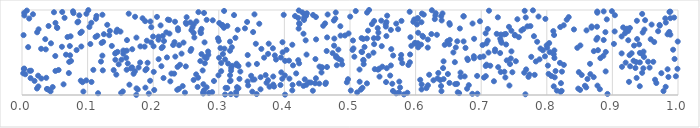
| Category | Series 0 |
|---|---|
| 0.17415233555775167 | 0.001 |
| 0.3267165777901435 | 0.003 |
| 0.40098579643262144 | 0.004 |
| 0.3095688186103528 | 0.006 |
| 0.5822616373367977 | 0.007 |
| 0.7673834045400926 | 0.008 |
| 0.3184749597028139 | 0.01 |
| 0.3576364063214017 | 0.011 |
| 0.8924957382449441 | 0.013 |
| 0.6864519221195118 | 0.014 |
| 0.6941650764544121 | 0.015 |
| 0.19330679095265535 | 0.017 |
| 0.2762896704294624 | 0.018 |
| 0.5704483367503989 | 0.02 |
| 0.11596705233783045 | 0.021 |
| 0.6663620786262896 | 0.022 |
| 0.28502951752498995 | 0.024 |
| 0.1511861886473287 | 0.025 |
| 0.5874161819290087 | 0.026 |
| 0.24837753763317516 | 0.028 |
| 0.5746186854391183 | 0.029 |
| 0.5109133764841309 | 0.031 |
| 0.6642649701503108 | 0.032 |
| 0.2898470303478975 | 0.033 |
| 0.27629961000573255 | 0.035 |
| 0.3264565690923459 | 0.036 |
| 0.8209746362123888 | 0.038 |
| 0.35108139517483206 | 0.039 |
| 0.09357554995508288 | 0.04 |
| 0.1536715389560417 | 0.042 |
| 0.04352839681271592 | 0.043 |
| 0.6394245126020789 | 0.045 |
| 0.9778816277948084 | 0.046 |
| 0.5655316001285667 | 0.047 |
| 0.8226224078419966 | 0.049 |
| 0.44337046952986003 | 0.05 |
| 0.8153181918369967 | 0.052 |
| 0.5012525339147966 | 0.053 |
| 0.41199090207481726 | 0.054 |
| 0.27743254483263613 | 0.056 |
| 0.04132815661761591 | 0.057 |
| 0.2015772101087575 | 0.059 |
| 0.8507807914339004 | 0.06 |
| 0.2366212121968162 | 0.061 |
| 0.5164366669893682 | 0.063 |
| 0.176457744678861 | 0.064 |
| 0.6090822513360802 | 0.066 |
| 0.36361335129340977 | 0.067 |
| 0.8808942582099177 | 0.068 |
| 0.03855602436475558 | 0.07 |
| 0.03803766517475782 | 0.071 |
| 0.23924007262587177 | 0.073 |
| 0.6784871758009946 | 0.074 |
| 0.8479532505951944 | 0.075 |
| 0.02287641990411038 | 0.077 |
| 0.1745891157942836 | 0.078 |
| 0.32995453502639416 | 0.079 |
| 0.6165151254171015 | 0.081 |
| 0.3128138252140522 | 0.082 |
| 0.3103818537578985 | 0.084 |
| 0.5190177345153396 | 0.085 |
| 0.18812397332812403 | 0.086 |
| 0.5763704846900805 | 0.088 |
| 0.8601183373076069 | 0.089 |
| 0.2814577322502573 | 0.091 |
| 0.32777769170459603 | 0.092 |
| 0.0467712006635278 | 0.093 |
| 0.2676915436617193 | 0.095 |
| 0.9812395779526505 | 0.096 |
| 0.37728414601620885 | 0.098 |
| 0.3842804015212071 | 0.099 |
| 0.02496216016820807 | 0.1 |
| 0.8105937593416628 | 0.102 |
| 0.9417160902518191 | 0.103 |
| 0.24493541329987856 | 0.105 |
| 0.6388234430418588 | 0.106 |
| 0.4290893445407079 | 0.107 |
| 0.8581404154737656 | 0.109 |
| 0.8772539218580032 | 0.11 |
| 0.7430241985343964 | 0.112 |
| 0.34477042719911133 | 0.113 |
| 0.6188354076364074 | 0.114 |
| 0.6810784169923804 | 0.116 |
| 0.39401045223231845 | 0.117 |
| 0.41245318495903494 | 0.119 |
| 0.43348443813965465 | 0.12 |
| 0.1637524203750127 | 0.121 |
| 0.38302824945062586 | 0.123 |
| 0.6092952466262179 | 0.124 |
| 0.06334629622360777 | 0.126 |
| 0.27645927020184113 | 0.127 |
| 0.6603495523566433 | 0.128 |
| 0.4625039786047813 | 0.13 |
| 0.6632460137972748 | 0.131 |
| 0.564435676206291 | 0.132 |
| 0.45317203978727016 | 0.134 |
| 0.42229318997480314 | 0.135 |
| 0.525840197390822 | 0.137 |
| 0.44677677184521647 | 0.138 |
| 0.821569245726998 | 0.139 |
| 0.9669668168928013 | 0.141 |
| 0.651630823291615 | 0.142 |
| 0.37274753102901736 | 0.144 |
| 0.46330215005993314 | 0.145 |
| 0.44029828310587094 | 0.146 |
| 0.43697004434812636 | 0.148 |
| 0.4951958973078491 | 0.149 |
| 0.09221263411865321 | 0.151 |
| 0.5549433149496668 | 0.152 |
| 0.1059565645538566 | 0.153 |
| 0.9253044074732074 | 0.155 |
| 0.5147080072962037 | 0.156 |
| 0.5751608997674716 | 0.158 |
| 0.34383115924762087 | 0.159 |
| 0.22613279811140863 | 0.16 |
| 0.7193987672047559 | 0.162 |
| 0.3170114172833569 | 0.163 |
| 0.2926358629292709 | 0.165 |
| 0.019064845973301603 | 0.166 |
| 0.19534812638048005 | 0.167 |
| 0.08961814393098977 | 0.169 |
| 0.3180019052779104 | 0.17 |
| 0.09794480573317665 | 0.172 |
| 0.6272224001311495 | 0.173 |
| 0.37506632999475775 | 0.174 |
| 0.6375335263933828 | 0.176 |
| 0.26165451568351583 | 0.177 |
| 0.6070525270367 | 0.179 |
| 0.9650103187007967 | 0.18 |
| 0.3514966595963539 | 0.181 |
| 0.35440789176859755 | 0.183 |
| 0.4310460891625082 | 0.184 |
| 0.4969971830480029 | 0.185 |
| 0.6426773827214013 | 0.187 |
| 0.8620063767366707 | 0.188 |
| 0.3314923231673542 | 0.19 |
| 0.3967371370787942 | 0.191 |
| 0.4076647048097607 | 0.192 |
| 0.02951782544512571 | 0.194 |
| 0.6334205564746916 | 0.195 |
| 0.4480365862461576 | 0.197 |
| 0.01308138685638438 | 0.198 |
| 0.2157391287326743 | 0.199 |
| 0.9369051288633318 | 0.201 |
| 0.03697881213068965 | 0.202 |
| 0.2684537085140726 | 0.204 |
| 0.7042880043128501 | 0.205 |
| 0.7368283907138232 | 0.206 |
| 0.8120638520166237 | 0.208 |
| 0.36376261681447997 | 0.209 |
| 0.8714855880579583 | 0.211 |
| 0.9853747208453758 | 0.212 |
| 0.7720695899457407 | 0.213 |
| 0.6685496223278226 | 0.215 |
| 0.5449723636573165 | 0.216 |
| 0.38300510460076775 | 0.218 |
| 0.6747988309976195 | 0.219 |
| 0.9967311171504589 | 0.22 |
| 0.7070521014617873 | 0.222 |
| 0.8071010924647902 | 0.223 |
| 0.6937895449187815 | 0.225 |
| 0.34931400348166486 | 0.226 |
| 0.02459828179625989 | 0.227 |
| 0.5612804648814013 | 0.229 |
| 0.4006789493915881 | 0.23 |
| 0.2994649585555704 | 0.232 |
| 0.3171430444057638 | 0.233 |
| 0.371367907186257 | 0.234 |
| 0.8532139129370673 | 0.236 |
| 0.7815103298390677 | 0.237 |
| 0.6207198406196087 | 0.238 |
| 0.14377193633414076 | 0.24 |
| 0.7735291892319879 | 0.241 |
| 0.2655019760378562 | 0.243 |
| 0.004948661072919802 | 0.244 |
| 0.8663802341256382 | 0.245 |
| 0.6492464571617418 | 0.247 |
| 0.8027420928507824 | 0.248 |
| 0.17009956933439285 | 0.25 |
| 0.23194339100037786 | 0.251 |
| 0.22777536037365254 | 0.252 |
| 0.41796600102300896 | 0.254 |
| 0.0018266469628940296 | 0.255 |
| 0.974643296418802 | 0.257 |
| 0.07139645209975332 | 0.258 |
| 0.6346040305609278 | 0.259 |
| 0.9453311780595132 | 0.261 |
| 0.7655889091287048 | 0.262 |
| 0.6685031744909532 | 0.264 |
| 0.4565505367451058 | 0.265 |
| 0.39528963762454494 | 0.266 |
| 0.7475339834609904 | 0.268 |
| 0.8488357212828215 | 0.269 |
| 0.7298081395161048 | 0.271 |
| 0.20082721708117135 | 0.272 |
| 0.7353295032465735 | 0.273 |
| 0.8230739943740694 | 0.275 |
| 0.33283538690399594 | 0.276 |
| 0.8897371701881751 | 0.278 |
| 0.17214513579734347 | 0.279 |
| 0.30367517558359436 | 0.28 |
| 0.8133298844675799 | 0.282 |
| 0.05099729489354676 | 0.283 |
| 0.011521324529946031 | 0.285 |
| 0.013759557636553676 | 0.286 |
| 0.3186810237401636 | 0.287 |
| 0.27540157090866235 | 0.289 |
| 0.12318280177487839 | 0.29 |
| 0.18816721136988834 | 0.291 |
| 0.139754426446423 | 0.293 |
| 0.0557760979531049 | 0.294 |
| 0.10874776882634662 | 0.296 |
| 0.1595218511214106 | 0.297 |
| 0.5426716711792345 | 0.298 |
| 0.5145205345386216 | 0.3 |
| 0.7685551467430047 | 0.301 |
| 0.9841401926982285 | 0.303 |
| 0.5377680364203787 | 0.304 |
| 0.002790070709704051 | 0.305 |
| 0.19003148126588532 | 0.307 |
| 0.9991593876172473 | 0.308 |
| 0.5446796335226294 | 0.31 |
| 0.0034139228578822234 | 0.311 |
| 0.1661026218302183 | 0.312 |
| 0.9471727730132119 | 0.314 |
| 0.5560882416403484 | 0.315 |
| 0.6418930240726614 | 0.317 |
| 0.9350765748615465 | 0.318 |
| 0.31893316954166384 | 0.319 |
| 0.45663217339878803 | 0.321 |
| 0.9566968369750841 | 0.322 |
| 0.17776330132469131 | 0.324 |
| 0.16786929917665339 | 0.325 |
| 0.45737237359137506 | 0.326 |
| 0.7259172164810624 | 0.328 |
| 0.46493962354778906 | 0.329 |
| 0.2371007303200896 | 0.331 |
| 0.9146226458355605 | 0.332 |
| 0.5493048259949521 | 0.333 |
| 0.45347214442592265 | 0.335 |
| 0.24970544762589053 | 0.336 |
| 0.9270363470228813 | 0.338 |
| 0.21251791548318688 | 0.339 |
| 0.3300206388064093 | 0.34 |
| 0.7068771850372884 | 0.342 |
| 0.3202887589511859 | 0.343 |
| 0.7138243101014865 | 0.344 |
| 0.8016571773127329 | 0.346 |
| 0.5622863411028683 | 0.347 |
| 0.41314753268536264 | 0.349 |
| 0.47991731931818304 | 0.35 |
| 0.3272677256531865 | 0.351 |
| 0.5890447886579944 | 0.353 |
| 0.8260133097288356 | 0.354 |
| 0.24079937639113835 | 0.356 |
| 0.7082039247142847 | 0.357 |
| 0.3451896654648441 | 0.358 |
| 0.48807294405046653 | 0.36 |
| 0.14739519636854015 | 0.361 |
| 0.5208737998015173 | 0.363 |
| 0.7439602116562637 | 0.364 |
| 0.35812059726106593 | 0.365 |
| 0.8658779519833733 | 0.367 |
| 0.3270015078273788 | 0.368 |
| 0.31417306729617045 | 0.37 |
| 0.16124894606557016 | 0.371 |
| 0.4224524498261405 | 0.372 |
| 0.2787610209251118 | 0.374 |
| 0.5797096729756539 | 0.375 |
| 0.3037310757513245 | 0.377 |
| 0.820062562262344 | 0.378 |
| 0.1914411227012931 | 0.379 |
| 0.9202256342344645 | 0.381 |
| 0.18013497787109856 | 0.382 |
| 0.9418677939853222 | 0.384 |
| 0.5912987097032684 | 0.385 |
| 0.6598378487785811 | 0.386 |
| 0.9361186530822996 | 0.388 |
| 0.07193848168688477 | 0.389 |
| 0.9622964580040382 | 0.391 |
| 0.9544586460834988 | 0.392 |
| 0.12037344095584457 | 0.393 |
| 0.7833126621325796 | 0.395 |
| 0.6426503610479861 | 0.396 |
| 0.7528084016367185 | 0.397 |
| 0.2718318339091724 | 0.399 |
| 0.07470944575363936 | 0.4 |
| 0.40100723120940684 | 0.402 |
| 0.9322287336178012 | 0.403 |
| 0.4070138547738472 | 0.404 |
| 0.5205908228571432 | 0.406 |
| 0.7389741432773567 | 0.407 |
| 0.48666302206728407 | 0.409 |
| 0.4210883871660678 | 0.41 |
| 0.6796588095273353 | 0.411 |
| 0.5202987781710223 | 0.413 |
| 0.14231063344503814 | 0.414 |
| 0.1516518420782318 | 0.416 |
| 0.3872554624740119 | 0.417 |
| 0.30962789337811125 | 0.418 |
| 0.7889038093619225 | 0.42 |
| 0.20827016756323247 | 0.421 |
| 0.44732396953738807 | 0.423 |
| 0.9947643522647984 | 0.424 |
| 0.577511258207087 | 0.425 |
| 0.48237957960391575 | 0.427 |
| 0.6788129393775014 | 0.428 |
| 0.7450990057050695 | 0.43 |
| 0.6890320740514729 | 0.431 |
| 0.28123378168493607 | 0.432 |
| 0.8816480415287197 | 0.434 |
| 0.8116252203139921 | 0.435 |
| 0.15885355957091496 | 0.437 |
| 0.3004359381533074 | 0.438 |
| 0.36907393993050197 | 0.439 |
| 0.3947218594014984 | 0.441 |
| 0.22097429583907702 | 0.442 |
| 0.4789147564621785 | 0.444 |
| 0.6982419258656538 | 0.445 |
| 0.27841420636827996 | 0.446 |
| 0.9481272680273157 | 0.448 |
| 0.7763260805430761 | 0.449 |
| 0.5066614631459274 | 0.45 |
| 0.23372250872603717 | 0.452 |
| 0.7034669911681022 | 0.453 |
| 0.7972142841480359 | 0.455 |
| 0.6887878371026958 | 0.456 |
| 0.4789246282539622 | 0.457 |
| 0.050767545233491584 | 0.459 |
| 0.8861802202640587 | 0.46 |
| 0.528428203315386 | 0.462 |
| 0.12253264694324839 | 0.463 |
| 0.5658194856325022 | 0.464 |
| 0.38539994520536713 | 0.466 |
| 0.07330444784688295 | 0.467 |
| 0.9261048215978862 | 0.469 |
| 0.34404274068990004 | 0.47 |
| 0.5780252835930141 | 0.471 |
| 0.2839979004586286 | 0.473 |
| 0.06705130902829493 | 0.474 |
| 0.43375953238941145 | 0.476 |
| 0.5915856020830247 | 0.477 |
| 0.8105740236920781 | 0.478 |
| 0.945598132822877 | 0.48 |
| 0.27363380977452767 | 0.481 |
| 0.3063295332636441 | 0.483 |
| 0.3751199429993607 | 0.484 |
| 0.1544873756792463 | 0.485 |
| 0.24321166438118713 | 0.487 |
| 0.14199709213032607 | 0.488 |
| 0.9140884247214297 | 0.49 |
| 0.929307224070591 | 0.491 |
| 0.47353826414352473 | 0.492 |
| 0.7288646641995803 | 0.494 |
| 0.9418626475651848 | 0.495 |
| 0.14325278197183744 | 0.497 |
| 0.5357465610791718 | 0.498 |
| 0.7111420451661441 | 0.499 |
| 0.6575737055788774 | 0.501 |
| 0.3972704596863019 | 0.502 |
| 0.8045725542828471 | 0.503 |
| 0.5184198281885304 | 0.505 |
| 0.8899040462911296 | 0.506 |
| 0.1456850999443008 | 0.508 |
| 0.5175489234509786 | 0.509 |
| 0.9474430778498911 | 0.51 |
| 0.28371311812516453 | 0.512 |
| 0.7460719760933302 | 0.513 |
| 0.7208890189913058 | 0.515 |
| 0.8717082323191946 | 0.516 |
| 0.46441128369593276 | 0.517 |
| 0.25685689420846414 | 0.519 |
| 0.31709009754065354 | 0.52 |
| 0.15964998082277837 | 0.522 |
| 0.15446482413654794 | 0.523 |
| 0.8115301125599712 | 0.524 |
| 0.7940475552965478 | 0.526 |
| 0.8780484284898948 | 0.527 |
| 0.08318880557032915 | 0.529 |
| 0.5038113073030006 | 0.53 |
| 0.40328641560530154 | 0.531 |
| 0.9925636243431475 | 0.533 |
| 0.4822106204363793 | 0.534 |
| 0.7211631276536827 | 0.536 |
| 0.03624535340826662 | 0.537 |
| 0.16804245037708265 | 0.538 |
| 0.5629066993704978 | 0.54 |
| 0.25809949093618734 | 0.541 |
| 0.3648838105701584 | 0.543 |
| 0.029150309871996738 | 0.544 |
| 0.30862525296487564 | 0.545 |
| 0.7903981931281537 | 0.547 |
| 0.5052684386187392 | 0.548 |
| 0.3824597620944087 | 0.55 |
| 0.3025145370402663 | 0.551 |
| 0.21284540762783843 | 0.552 |
| 0.676075702887164 | 0.554 |
| 0.8465178849497058 | 0.555 |
| 0.8005445903762116 | 0.556 |
| 0.6185038238779765 | 0.558 |
| 0.661259090904995 | 0.559 |
| 0.6038401962392357 | 0.561 |
| 0.319841768181343 | 0.562 |
| 0.009397028187036027 | 0.563 |
| 0.5221670957272013 | 0.565 |
| 0.2145809982636595 | 0.566 |
| 0.060863410120352124 | 0.568 |
| 0.18691761675431906 | 0.569 |
| 0.09042646953023781 | 0.57 |
| 0.18048255494288057 | 0.572 |
| 0.2005843973110759 | 0.573 |
| 0.5483809090549919 | 0.575 |
| 0.07289119463849136 | 0.576 |
| 0.13691807378407628 | 0.577 |
| 0.5934758105561845 | 0.579 |
| 0.47573072041867714 | 0.58 |
| 0.9330139940639374 | 0.582 |
| 0.8511734314774522 | 0.583 |
| 0.7998168858034705 | 0.584 |
| 0.2394042805190153 | 0.586 |
| 0.7020545217055159 | 0.587 |
| 0.23041820392680534 | 0.589 |
| 0.644381248849065 | 0.59 |
| 0.41205832117248586 | 0.591 |
| 0.6083383523489974 | 0.593 |
| 0.7379829674472316 | 0.594 |
| 0.9407564412524406 | 0.596 |
| 0.6512334243546404 | 0.597 |
| 0.5367559498589979 | 0.598 |
| 0.10415977442219415 | 0.6 |
| 0.9023023379679167 | 0.601 |
| 0.3564354006917586 | 0.603 |
| 0.37608328896592225 | 0.604 |
| 0.5986345107435488 | 0.605 |
| 0.7078979043697402 | 0.607 |
| 0.044164223009157344 | 0.608 |
| 0.6033323872390332 | 0.609 |
| 0.8036467597272969 | 0.611 |
| 0.12139051572205373 | 0.612 |
| 0.5991304014707598 | 0.614 |
| 0.7310273487810828 | 0.615 |
| 0.24620499027214582 | 0.616 |
| 0.19689745811195458 | 0.618 |
| 0.27829920601230695 | 0.619 |
| 0.39709459504808675 | 0.621 |
| 0.23247260189613628 | 0.622 |
| 0.9637263674286265 | 0.623 |
| 0.12370388056767911 | 0.625 |
| 0.7853057170694946 | 0.626 |
| 0.31711980420451813 | 0.628 |
| 0.9995943606098459 | 0.629 |
| 0.6731603137832214 | 0.63 |
| 0.6635531123494557 | 0.632 |
| 0.6485195412388425 | 0.633 |
| 0.21645518259262397 | 0.635 |
| 0.2999560811572973 | 0.636 |
| 0.7298652557075007 | 0.637 |
| 0.19031266820267256 | 0.639 |
| 0.7099219042592295 | 0.64 |
| 0.5045582000046115 | 0.642 |
| 0.4324312937511291 | 0.643 |
| 0.9241773036597304 | 0.644 |
| 0.16005976728347948 | 0.646 |
| 0.8867142152736852 | 0.647 |
| 0.652164777957375 | 0.649 |
| 0.20805243524898975 | 0.65 |
| 0.8755537638983515 | 0.651 |
| 0.6186547600113494 | 0.653 |
| 0.4482833690439233 | 0.654 |
| 0.9584094968640197 | 0.656 |
| 0.03546891137530528 | 0.657 |
| 0.937742974361477 | 0.658 |
| 0.5200136395385793 | 0.66 |
| 0.6891718407619049 | 0.661 |
| 0.7290326455307443 | 0.662 |
| 0.4761215333448171 | 0.664 |
| 0.5258333974943151 | 0.665 |
| 0.2986937813879077 | 0.667 |
| 0.5363002482414683 | 0.668 |
| 0.5176379295810067 | 0.669 |
| 0.5423938605886816 | 0.671 |
| 0.3253334156384221 | 0.672 |
| 0.8772644584423116 | 0.674 |
| 0.17442472140213527 | 0.675 |
| 0.2627527705617464 | 0.676 |
| 0.46514291686429154 | 0.678 |
| 0.5921119414700499 | 0.679 |
| 0.7573383957088807 | 0.681 |
| 0.06939374144385624 | 0.682 |
| 0.11211869905572436 | 0.683 |
| 0.6114496928619373 | 0.685 |
| 0.20812115142417986 | 0.686 |
| 0.1998436586057376 | 0.688 |
| 0.9140950652841078 | 0.689 |
| 0.07407030390660896 | 0.69 |
| 0.7804071262648354 | 0.692 |
| 0.5554687683077065 | 0.693 |
| 0.21455050267362208 | 0.695 |
| 0.6104575472185562 | 0.696 |
| 0.11482888821270087 | 0.697 |
| 0.4856508760122844 | 0.699 |
| 0.49227643811257715 | 0.7 |
| 0.7512562394321524 | 0.702 |
| 0.13293301344225417 | 0.703 |
| 0.0023617465716528896 | 0.704 |
| 0.8111081791252885 | 0.706 |
| 0.7513311856992982 | 0.707 |
| 0.6324801093499435 | 0.709 |
| 0.9883052385683846 | 0.71 |
| 0.7300299381646311 | 0.711 |
| 0.73493689992717 | 0.713 |
| 0.9840813792119885 | 0.714 |
| 0.12481813188320168 | 0.715 |
| 0.624088019190222 | 0.717 |
| 0.7375030695447178 | 0.718 |
| 0.7236587987621885 | 0.72 |
| 0.42907969595089 | 0.721 |
| 0.22478985051133926 | 0.722 |
| 0.49781179641446227 | 0.724 |
| 0.7067974806232459 | 0.725 |
| 0.9192228372721897 | 0.727 |
| 0.27271729067682904 | 0.728 |
| 0.0890301010160216 | 0.729 |
| 0.2616462730461757 | 0.731 |
| 0.6038762665303371 | 0.732 |
| 0.5432446117744656 | 0.734 |
| 0.9462062554852455 | 0.735 |
| 0.21993575581615876 | 0.736 |
| 0.023089127585993907 | 0.738 |
| 0.8893486414626153 | 0.739 |
| 0.35230491946920617 | 0.741 |
| 0.9867116038826289 | 0.742 |
| 0.14376342439285106 | 0.743 |
| 0.09110283525882323 | 0.745 |
| 0.1501038964240462 | 0.746 |
| 0.9034739635113318 | 0.748 |
| 0.2720838168626055 | 0.749 |
| 0.9696652062417156 | 0.75 |
| 0.8099523763813136 | 0.752 |
| 0.9240634849234851 | 0.753 |
| 0.13397126140261262 | 0.755 |
| 0.7460727262478674 | 0.756 |
| 0.5274921338777315 | 0.757 |
| 0.7613053201208448 | 0.759 |
| 0.8605583198818932 | 0.76 |
| 0.2379817633451975 | 0.762 |
| 0.25824819777299846 | 0.763 |
| 0.9210008939076068 | 0.764 |
| 0.5623091500930689 | 0.766 |
| 0.3287606595746302 | 0.767 |
| 0.1451376074050993 | 0.768 |
| 0.9488282043420098 | 0.77 |
| 0.8413898305641091 | 0.771 |
| 0.025279979371331973 | 0.773 |
| 0.5733162533047274 | 0.774 |
| 0.7643677157269151 | 0.775 |
| 0.7100780743363956 | 0.777 |
| 0.2735618666902784 | 0.778 |
| 0.9221571255094682 | 0.78 |
| 0.42172368916975445 | 0.781 |
| 0.6674755779896115 | 0.782 |
| 0.33986419385557676 | 0.784 |
| 0.23765398681051741 | 0.785 |
| 0.5422130935561511 | 0.787 |
| 0.9266571646061313 | 0.788 |
| 0.05376017549040868 | 0.789 |
| 0.3077492138150759 | 0.791 |
| 0.8682333474085056 | 0.792 |
| 0.05331340928477646 | 0.794 |
| 0.9164335356521109 | 0.795 |
| 0.25994414146438316 | 0.796 |
| 0.1970887572876857 | 0.798 |
| 0.8204895583708108 | 0.799 |
| 0.10272423160626964 | 0.801 |
| 0.7423310045076348 | 0.802 |
| 0.8765332991269975 | 0.803 |
| 0.5545719401225675 | 0.805 |
| 0.8683457944020991 | 0.806 |
| 0.7704919433657006 | 0.808 |
| 0.48529979819803304 | 0.809 |
| 0.7750539733799994 | 0.81 |
| 0.04050432500062118 | 0.812 |
| 0.313037318480509 | 0.813 |
| 0.4591887022340707 | 0.815 |
| 0.972171540804946 | 0.816 |
| 0.30563932810649186 | 0.817 |
| 0.21129026922453154 | 0.819 |
| 0.8257581780450758 | 0.82 |
| 0.30478838992744317 | 0.821 |
| 0.3052057685790096 | 0.823 |
| 0.9719389499066206 | 0.824 |
| 0.1299445664436124 | 0.826 |
| 0.6521267380062261 | 0.827 |
| 0.9597794986969748 | 0.828 |
| 0.6020294737301963 | 0.83 |
| 0.26180728505951933 | 0.831 |
| 0.5543921446737184 | 0.833 |
| 0.5334234932801831 | 0.834 |
| 0.42308231575894517 | 0.835 |
| 0.25045580174305815 | 0.837 |
| 0.3616918241308811 | 0.838 |
| 0.5705027477550412 | 0.84 |
| 0.6868257267435175 | 0.841 |
| 0.4620783681111902 | 0.842 |
| 0.4225098731370187 | 0.844 |
| 0.6514953527674205 | 0.845 |
| 0.30070686608472763 | 0.847 |
| 0.051006679271272226 | 0.848 |
| 0.10565082810584636 | 0.849 |
| 0.2497281773786325 | 0.851 |
| 0.9814093491324744 | 0.852 |
| 0.2567782773085353 | 0.854 |
| 0.08454761357952334 | 0.855 |
| 0.6088794689073306 | 0.856 |
| 0.5555285310227336 | 0.858 |
| 0.3431712262973554 | 0.859 |
| 0.5965500930221446 | 0.861 |
| 0.23324444547547052 | 0.862 |
| 0.0857401910441542 | 0.863 |
| 0.19577975253791835 | 0.865 |
| 0.2658914990841351 | 0.866 |
| 0.6981483967678289 | 0.868 |
| 0.1877141757569034 | 0.869 |
| 0.5367848279768339 | 0.87 |
| 0.5784634538754463 | 0.872 |
| 0.937348448438287 | 0.873 |
| 0.5476972883239348 | 0.874 |
| 0.4753672611451695 | 0.876 |
| 0.6397560009474754 | 0.877 |
| 0.2907550077248928 | 0.879 |
| 0.9498640845685877 | 0.88 |
| 0.22457378523054516 | 0.881 |
| 0.4298876505798862 | 0.883 |
| 0.28150440563042345 | 0.884 |
| 0.830370205529525 | 0.886 |
| 0.2223482233291022 | 0.887 |
| 0.5980000522807669 | 0.888 |
| 0.8914480046644621 | 0.89 |
| 0.7551521668572917 | 0.891 |
| 0.6292521769558295 | 0.893 |
| 0.6026089081509375 | 0.894 |
| 0.7978420433756702 | 0.895 |
| 0.11269659664007292 | 0.897 |
| 0.47758902626802013 | 0.898 |
| 0.010926990977457085 | 0.9 |
| 0.9806105359852854 | 0.901 |
| 0.1837958358702746 | 0.902 |
| 0.9882713022117964 | 0.904 |
| 0.6033090116631946 | 0.905 |
| 0.42100646674618336 | 0.907 |
| 0.06488869895924587 | 0.908 |
| 0.4300205515496731 | 0.909 |
| 0.99409930350975 | 0.911 |
| 0.7679085217134973 | 0.912 |
| 0.7253891407884655 | 0.914 |
| 0.2509790914570955 | 0.915 |
| 0.833377947698205 | 0.916 |
| 0.44804325333196726 | 0.918 |
| 0.20576191993267368 | 0.919 |
| 0.1723703898678437 | 0.921 |
| 0.5003228958454209 | 0.922 |
| 0.7873536334495891 | 0.923 |
| 0.6730800735689576 | 0.925 |
| 0.6731928697029933 | 0.926 |
| 0.6390124923990966 | 0.927 |
| 0.41624285140451767 | 0.929 |
| 0.11348623032501926 | 0.93 |
| 0.4330303191484429 | 0.932 |
| 0.5566501645618761 | 0.933 |
| 0.6301226949535779 | 0.934 |
| 0.0035594690339425528 | 0.936 |
| 0.0873302232170623 | 0.937 |
| 0.90381257620103 | 0.939 |
| 0.32321688959884143 | 0.94 |
| 0.44369359332932357 | 0.941 |
| 0.39895216759483576 | 0.943 |
| 0.12257651131035674 | 0.944 |
| 0.612454330781043 | 0.946 |
| 0.4659219376336752 | 0.947 |
| 0.35437176732974196 | 0.948 |
| 0.01671889911276825 | 0.95 |
| 0.4318358980887389 | 0.951 |
| 0.4303936924650791 | 0.953 |
| 0.9453710746669136 | 0.954 |
| 0.09819093347907104 | 0.955 |
| 0.16267475976425072 | 0.957 |
| 0.6096780161373776 | 0.958 |
| 0.6409834528547782 | 0.96 |
| 0.4342918964705159 | 0.961 |
| 0.63068304078378 | 0.962 |
| 0.07848200123328786 | 0.964 |
| 0.2774528558950071 | 0.965 |
| 0.003463382572263418 | 0.967 |
| 0.8769898505870005 | 0.968 |
| 0.5260305522469862 | 0.969 |
| 0.4782803491235683 | 0.971 |
| 0.4272892186822729 | 0.972 |
| 0.04875174133445748 | 0.974 |
| 0.2689307275166264 | 0.975 |
| 0.0613243010010357 | 0.976 |
| 0.9869832469641084 | 0.978 |
| 0.5909651957506965 | 0.979 |
| 0.9882781967734476 | 0.98 |
| 0.8769195224371895 | 0.982 |
| 0.8866814467321513 | 0.983 |
| 0.07775566398853984 | 0.985 |
| 0.8992502286822369 | 0.986 |
| 0.5087479336566069 | 0.987 |
| 0.3080537930526164 | 0.989 |
| 0.7662933164340114 | 0.99 |
| 0.7118650564860606 | 0.992 |
| 0.007411359624701741 | 0.993 |
| 0.42190275759471485 | 0.994 |
| 0.7788801408318895 | 0.996 |
| 0.6248350900983731 | 0.997 |
| 0.10109583084557316 | 0.999 |
| 0.5290634647838259 | 1 |